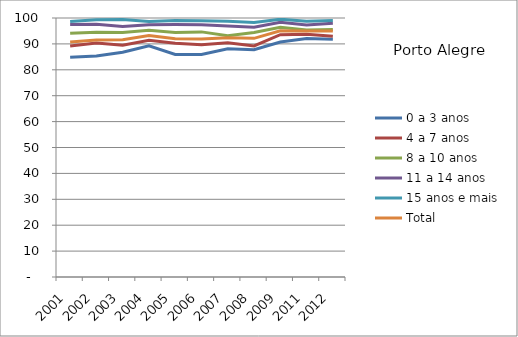
| Category | 0 a 3 anos | 4 a 7 anos | 8 a 10 anos | 11 a 14 anos | 15 anos e mais | Total |
|---|---|---|---|---|---|---|
| 2001.0 | 84.87 | 89.17 | 94.14 | 97.51 | 98.61 | 90.69 |
| 2002.0 | 85.35 | 90.35 | 94.47 | 97.58 | 99.32 | 91.48 |
| 2003.0 | 86.81 | 89.52 | 94.37 | 96.69 | 99.38 | 91.61 |
| 2004.0 | 89.25 | 91.36 | 95.26 | 97.4 | 98.61 | 93.23 |
| 2005.0 | 85.94 | 90.26 | 94.4 | 97.47 | 99.06 | 91.97 |
| 2006.0 | 85.89 | 89.69 | 94.64 | 97.38 | 98.94 | 91.93 |
| 2007.0 | 88.15 | 90.44 | 93.14 | 96.87 | 98.75 | 92.39 |
| 2008.0 | 87.77 | 89.19 | 94.41 | 96.43 | 98.3 | 92.14 |
| 2009.0 | 90.75 | 93.54 | 96.45 | 98.35 | 99.53 | 95.03 |
| 2011.0 | 92.09 | 93.7 | 95.41 | 97.32 | 98.78 | 95 |
| 2012.0 | 91.81 | 92.94 | 95.57 | 97.99 | 99.08 | 94.99 |